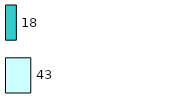
| Category | Series 0 | Series 1 |
|---|---|---|
| 0 | 43 | 18 |